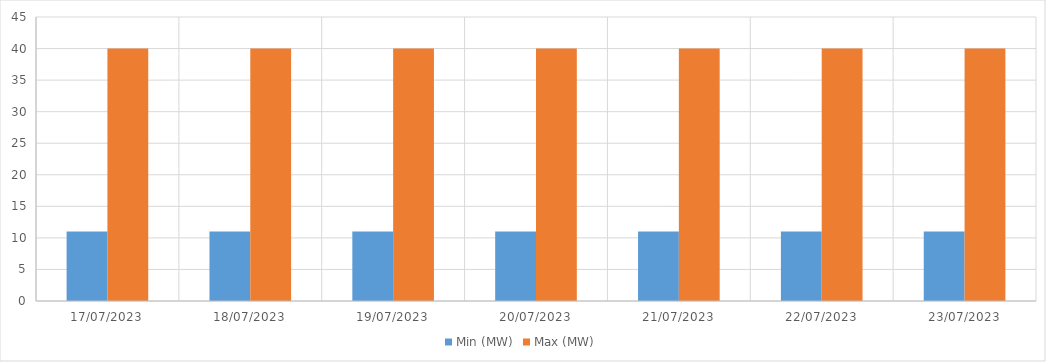
| Category | Min (MW) | Max (MW) |
|---|---|---|
| 17/07/2023 | 11 | 40 |
| 18/07/2023 | 11 | 40 |
| 19/07/2023 | 11 | 40 |
| 20/07/2023 | 11 | 40 |
| 21/07/2023 | 11 | 40 |
| 22/07/2023 | 11 | 40 |
| 23/07/2023 | 11 | 40 |